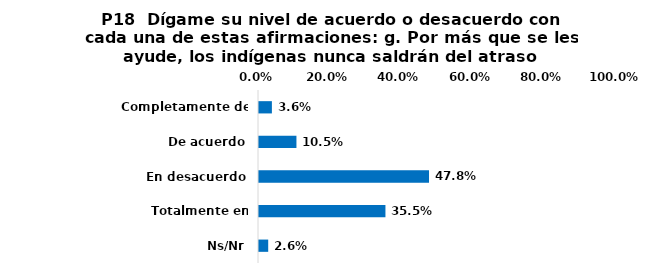
| Category | Series 0 |
|---|---|
| Completamente de acuerdo | 0.036 |
| De acuerdo | 0.105 |
| En desacuerdo | 0.478 |
| Totalmente en desacuerdo | 0.355 |
| Ns/Nr | 0.026 |